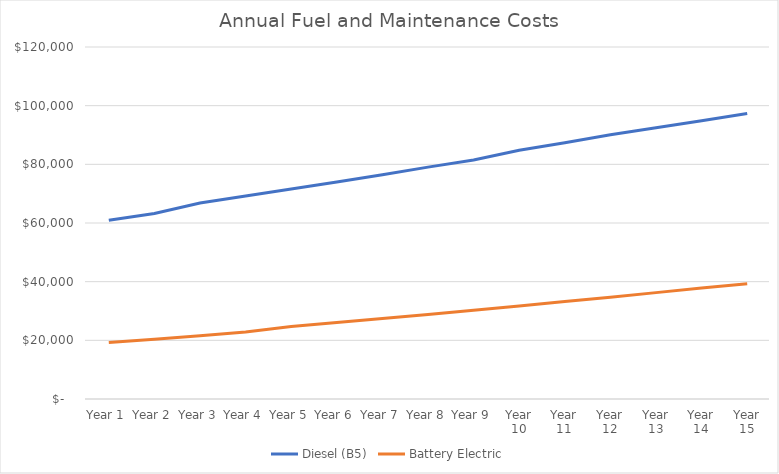
| Category | Diesel (B5) | Battery Electric |
|---|---|---|
| Year 1 | 60924.109 | 19292.408 |
| Year 2 | 63223.427 | 20372.986 |
| Year 3 | 66804.598 | 21550.076 |
| Year 4 | 69235.209 | 22870.228 |
| Year 5 | 71580.968 | 24679.266 |
| Year 6 | 73995.578 | 26048.627 |
| Year 7 | 76471.851 | 27413.682 |
| Year 8 | 79051.456 | 28822.148 |
| Year 9 | 81456.583 | 30289.954 |
| Year 10 | 84821.923 | 31676.347 |
| Year 11 | 87389.221 | 33200.14 |
| Year 12 | 90072.685 | 34655.282 |
| Year 13 | 92495.036 | 36264.352 |
| Year 14 | 94879.712 | 37805.042 |
| Year 15 | 97359.632 | 39278.833 |